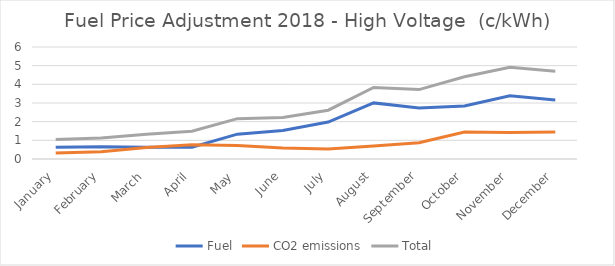
| Category | Fuel | CO2 emissions | Total |
|---|---|---|---|
| January | 0.626 | 0.32 | 1.05 |
| February | 0.653 | 0.386 | 1.125 |
| March | 0.625 | 0.616 | 1.323 |
| April | 0.628 | 0.76 | 1.488 |
| May | 1.332 | 0.717 | 2.16 |
| June | 1.53 | 0.583 | 2.219 |
| July | 1.979 | 0.534 | 2.615 |
| August | 3.006 | 0.693 | 3.835 |
| September | 2.732 | 0.869 | 3.717 |
| October | 2.836 | 1.445 | 4.407 |
| November | 3.388 | 1.416 | 4.913 |
| December | 3.162 | 1.443 | 4.706 |